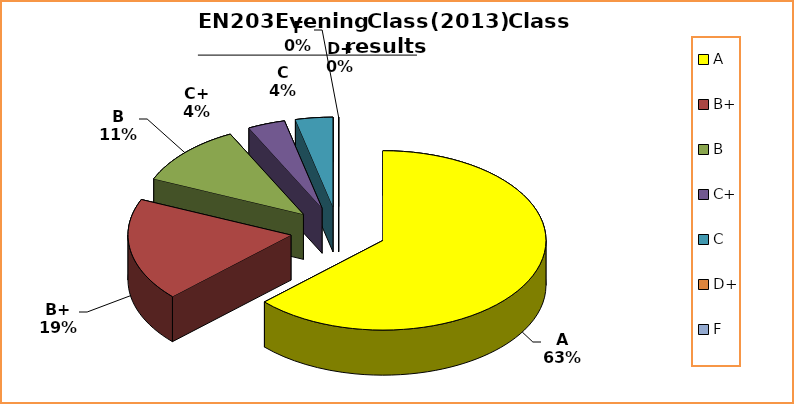
| Category | Series 0 |
|---|---|
| A | 17 |
| B+ | 5 |
| B | 3 |
| C+ | 1 |
| C | 1 |
| D+ | 0 |
| F | 0 |